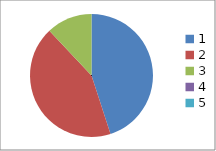
| Category | Series 0 |
|---|---|
| 0 | 0.45 |
| 1 | 0.43 |
| 2 | 0.12 |
| 3 | 0 |
| 4 | 0 |